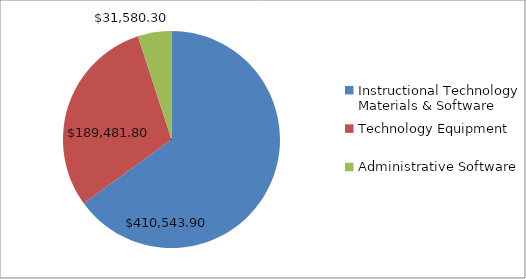
| Category | Series 0 |
|---|---|
| Instructional Technology Materials & Software | 410543.9 |
| Technology Equipment | 189481.8 |
| Administrative Software | 31580.3 |